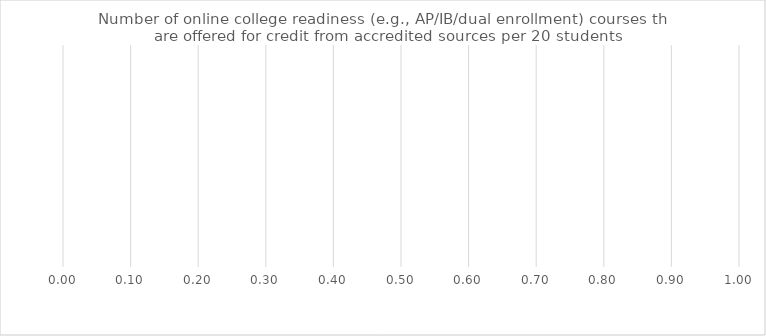
| Category | Benchmark | Entire LEA  | Title IV-A Identified Schools |
|---|---|---|---|
| Number of online college readiness (e.g., AP/IB/dual enrollment) courses that are offered for credit from accredited sources per 20 students | 0 | 0 | 0 |